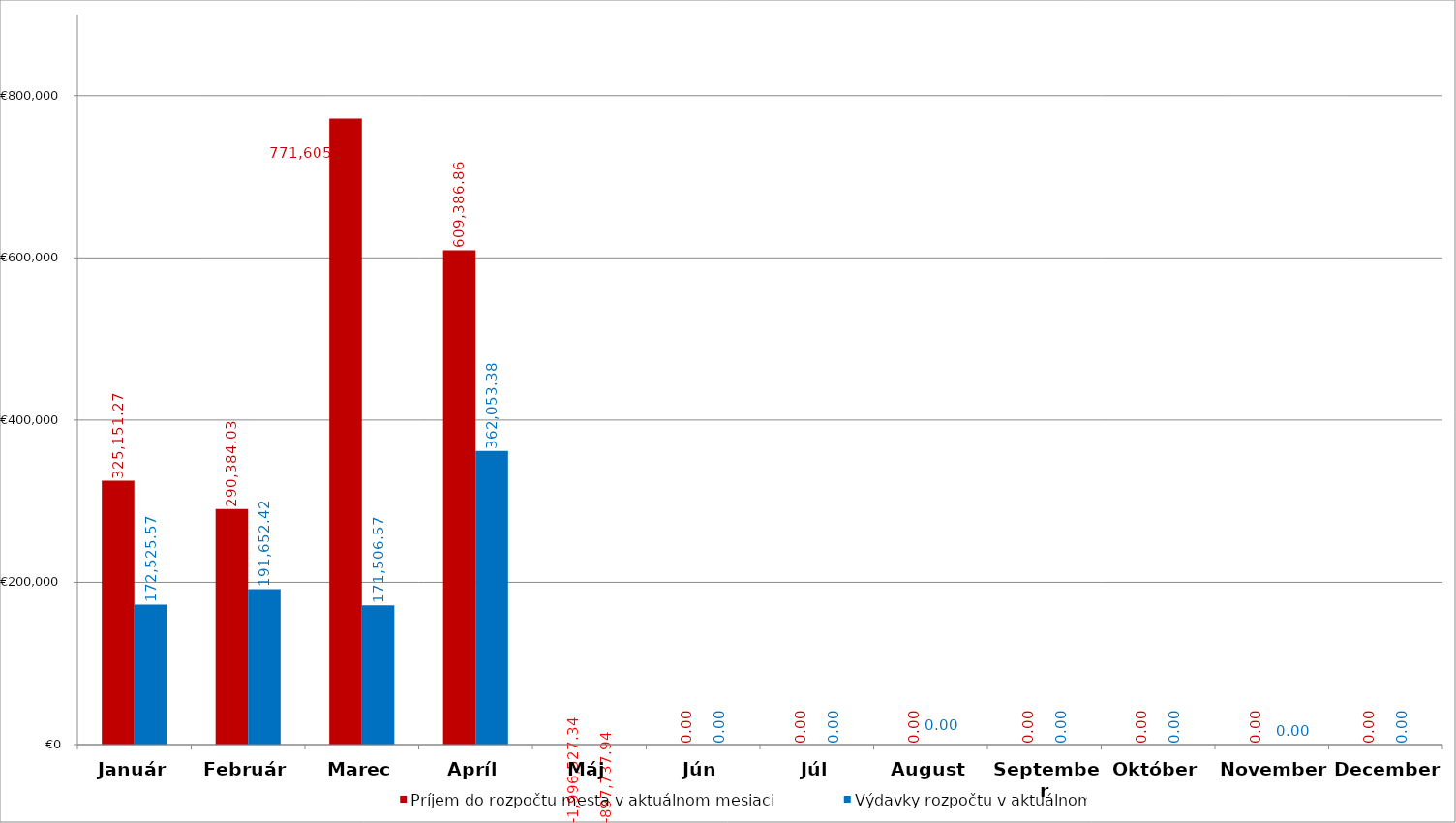
| Category | Príjem do rozpočtu mesta v aktuálnom mesiaci | Výdavky rozpočtu v aktuálnom  mesiaci |
|---|---|---|
| Január | 325151.27 | 172525.57 |
| Február | 290384.03 | 191652.42 |
| Marec | 771605.18 | 171506.57 |
| Apríl | 609386.86 | 362053.38 |
| Máj | -1996527.34 | -897737.94 |
| Jún | 0 | 0 |
| Júl | 0 | 0 |
| August | 0 | 0 |
| September | 0 | 0 |
| Október | 0 | 0 |
| November | 0 | 0 |
| December | 0 | 0 |